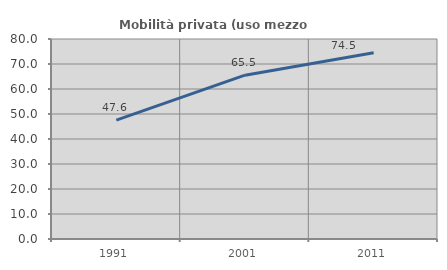
| Category | Mobilità privata (uso mezzo privato) |
|---|---|
| 1991.0 | 47.569 |
| 2001.0 | 65.519 |
| 2011.0 | 74.512 |